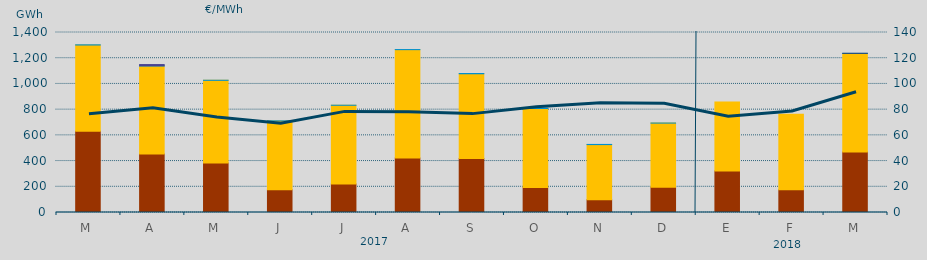
| Category | Carbón | Ciclo Combinado | Hidráulica | Nuclear | Otras Renovables |
|---|---|---|---|---|---|
| M | 631868 | 670791.6 | 1411.7 | 0 | 0 |
| A | 454829.4 | 684899.6 | 1412 | 9600 | 0 |
| M | 384999.4 | 642959.4 | 538 | 0 | 0 |
| J | 176734.4 | 535700.2 | 240 | 0 | 0 |
| J | 221645.5 | 612390.3 | 245 | 0 | 0 |
| A | 424631 | 842008.2 | 714.3 | 0 | 0 |
| S | 419522.2 | 659557.1 | 1903.2 | 0 | 0 |
| O | 195163.5 | 613794.4 | 1865.1 | 0 | 0 |
| N | 99779.8 | 428275.6 | 1458.4 | 0 | 0 |
| D | 195559 | 499810.1 | 237.7 | 0 | 0 |
| E | 323414.2 | 535924.4 | 0 | 0 | 0 |
| F | 176086.6 | 587965.4 | 0 | 0 | 0 |
| M | 469679.3 | 766935.8 | 790 | 0 | 1096.8 |